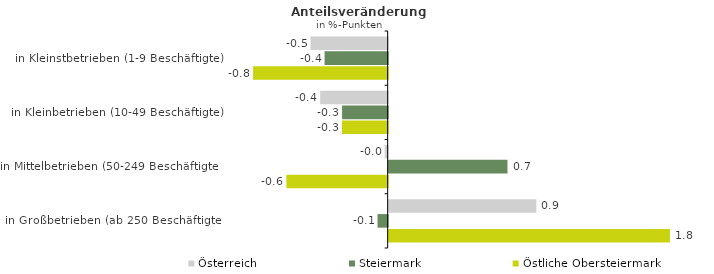
| Category | Österreich | Steiermark | Östliche Obersteiermark |
|---|---|---|---|
| in Kleinstbetrieben (1-9 Beschäftigte) | -0.48 | -0.393 | -0.838 |
| in Kleinbetrieben (10-49 Beschäftigte) | -0.42 | -0.284 | -0.284 |
| in Mittelbetrieben (50-249 Beschäftigte) | -0.019 | 0.74 | -0.63 |
| in Großbetrieben (ab 250 Beschäftigte) | 0.919 | -0.063 | 1.751 |